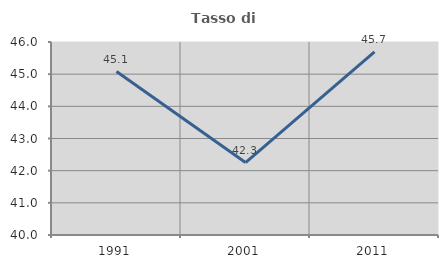
| Category | Tasso di occupazione   |
|---|---|
| 1991.0 | 45.08 |
| 2001.0 | 42.253 |
| 2011.0 | 45.693 |